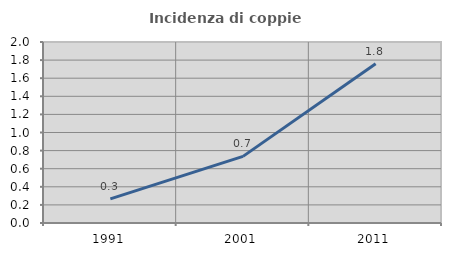
| Category | Incidenza di coppie miste |
|---|---|
| 1991.0 | 0.267 |
| 2001.0 | 0.736 |
| 2011.0 | 1.76 |